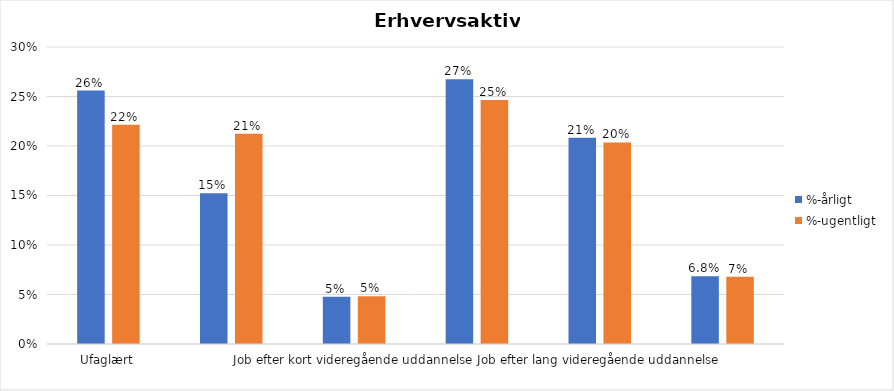
| Category | %-årligt | %-ugentligt |
|---|---|---|
| Ufaglært | 0.256 | 0.221 |
| Erhvervsfagligt job | 0.152 | 0.212 |
| Job efter kort videregående uddannelse | 0.048 | 0.048 |
| Job efter mellemlang videregående uddannelse | 0.267 | 0.246 |
| Job efter lang videregående uddannelse | 0.208 | 0.204 |
| Selvstændig | 0.068 | 0.068 |